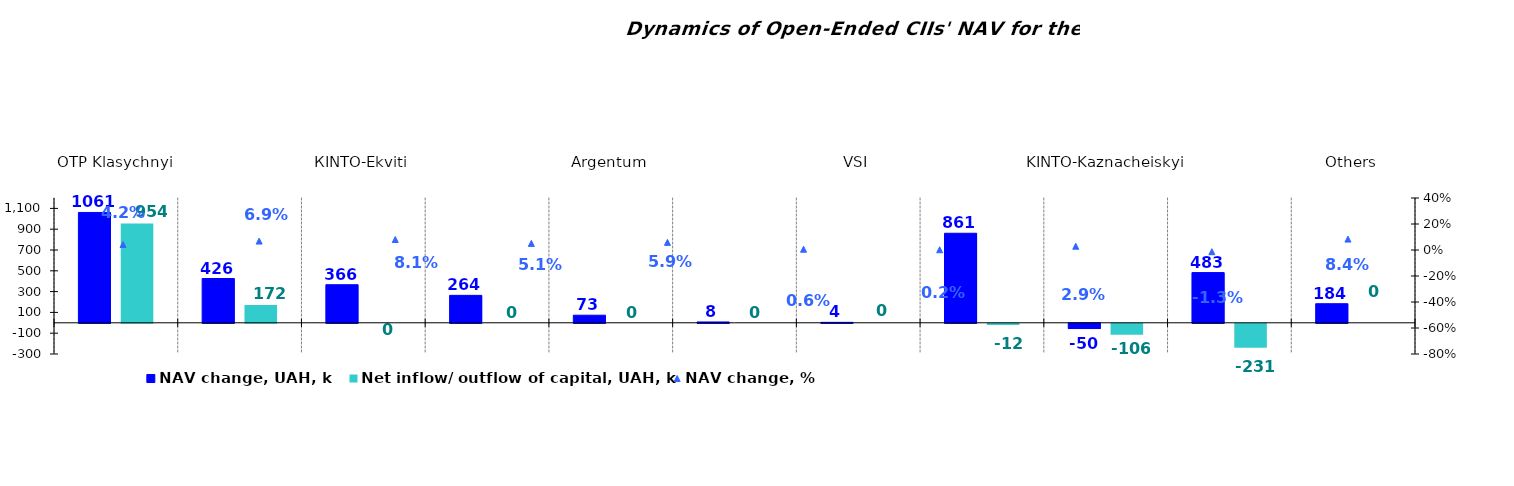
| Category | NAV change, UAH, k | Net inflow/ outflow of capital, UAH, k |
|---|---|---|
| OTP Klasychnyi | 1061.158 | 954.276 |
| UNIVER.UA/Iaroslav Mudryi: Fond Aktsii | 425.818 | 171.672 |
| КІNTO-Ekviti | 366.265 | 0 |
| Sofiivskyi | 263.826 | 0 |
| Argentum | 72.96 | 0 |
| UNIVER.UA/Taras Shevchenko: Fond Zaoshchadzhen | 8.081 | 0 |
| VSI | 4.166 | 0 |
| КІNТО-Klasychnyi | 860.929 | -11.651 |
| KINTO-Kaznacheiskyi | -50.313 | -106.201 |
| OTP Fond Aktsii | 482.71 | -230.518 |
| Others | 183.576 | 0 |